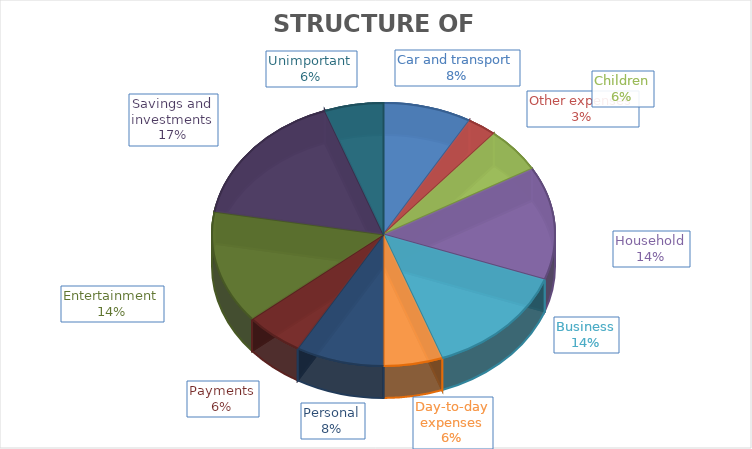
| Category | Series 0 |
|---|---|
| Car and transport | 3 |
| Other expenses | 1 |
| Children | 2 |
| Household | 5 |
| Business | 5 |
| Day-to-day expenses | 2 |
| Personal | 3 |
| Payments | 2 |
| Entertainment | 5 |
| Savings and investments | 6 |
| Unimportant | 2 |